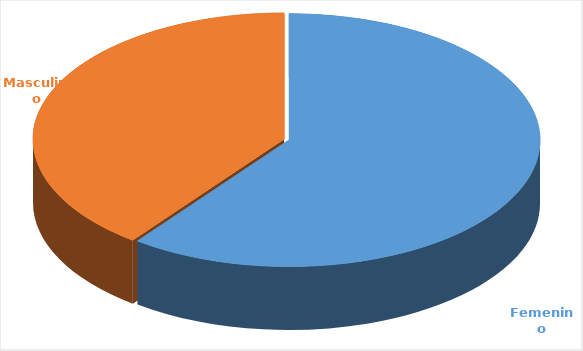
| Category | Cantidad  |
|---|---|
| Femenino | 3697 |
| Masculino | 2435 |